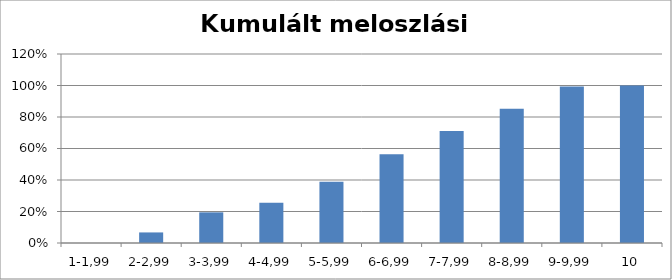
| Category | Series 0 |
|---|---|
| 1-1,99 | 0 |
| 2-2,99 | 0.067 |
| 3-3,99 | 0.195 |
| 4-4,99 | 0.255 |
| 5-5,99 | 0.389 |
| 6-6,99 | 0.564 |
| 7-7,99 | 0.711 |
| 8-8,99 | 0.852 |
| 9-9,99 | 0.993 |
| 10 | 1 |